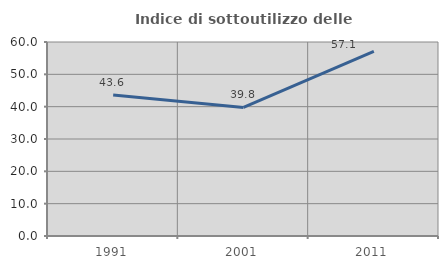
| Category | Indice di sottoutilizzo delle abitazioni  |
|---|---|
| 1991.0 | 43.609 |
| 2001.0 | 39.75 |
| 2011.0 | 57.068 |